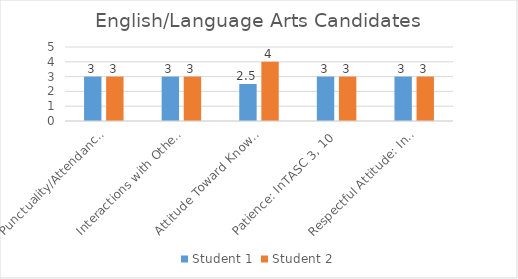
| Category | Student 1 | Student 2 |
|---|---|---|
| Punctuality/Attendance: InTASC 1, 9 | 3 | 3 |
| Interactions with Others: InTASC 3, 7, 10 | 3 | 3 |
| Attitude Toward Knowledge and Learning: InTASC 1, 4, 5, 9, 10 | 2.5 | 4 |
| Patience: InTASC 3, 10 | 3 | 3 |
| Respectful Attitude: InTASC 3, 7, 10 | 3 | 3 |